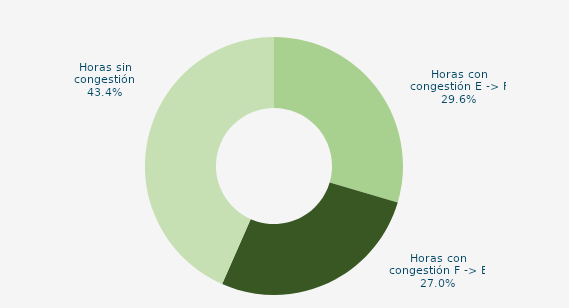
| Category | Horas con congestión E -> F |
|---|---|
| Horas con congestión E -> F | 29.57 |
| Horas con congestión F -> E | 27.016 |
| Horas sin congestión | 43.414 |